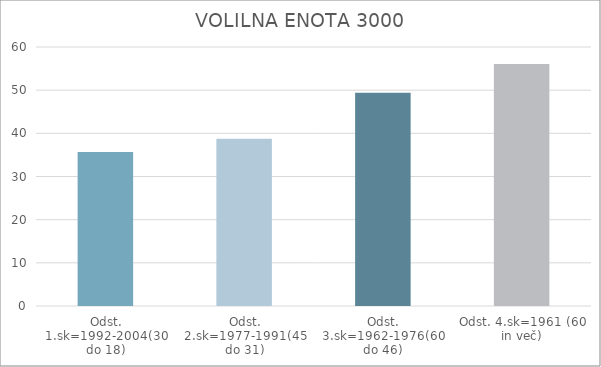
| Category | Series 0 |
|---|---|
| Odst. 1.sk=1992-2004(30 do 18) | 35.68 |
| Odst. 2.sk=1977-1991(45 do 31) | 38.76 |
| Odst. 3.sk=1962-1976(60 do 46) | 49.41 |
| Odst. 4.sk=1961 (60 in več) | 56.05 |